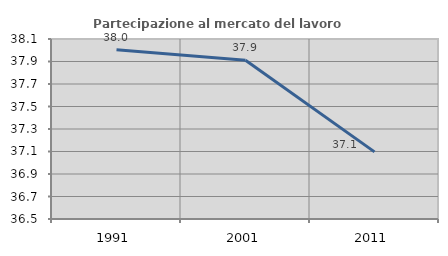
| Category | Partecipazione al mercato del lavoro  femminile |
|---|---|
| 1991.0 | 38.005 |
| 2001.0 | 37.911 |
| 2011.0 | 37.097 |